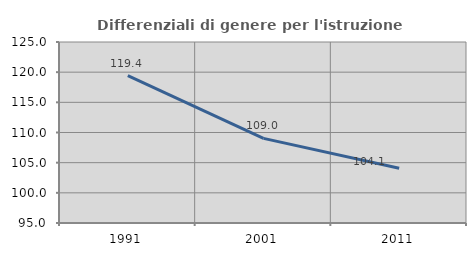
| Category | Differenziali di genere per l'istruzione superiore |
|---|---|
| 1991.0 | 119.439 |
| 2001.0 | 109.023 |
| 2011.0 | 104.061 |